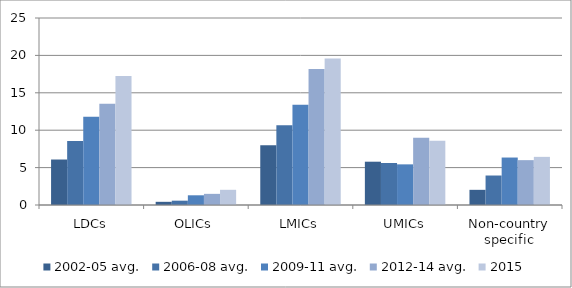
| Category | 2002-05 avg. | 2006-08 avg. | 2009-11 avg. | 2012-14 avg. | 2015 |
|---|---|---|---|---|---|
| LDCs | 6.081 | 8.564 | 11.815 | 13.534 | 17.244 |
| OLICs | 0.425 | 0.578 | 1.298 | 1.49 | 2.031 |
| LMICs | 7.987 | 10.648 | 13.39 | 18.191 | 19.592 |
| UMICs | 5.789 | 5.611 | 5.434 | 8.984 | 8.575 |
| Non-country specific | 2.028 | 3.942 | 6.345 | 5.996 | 6.436 |